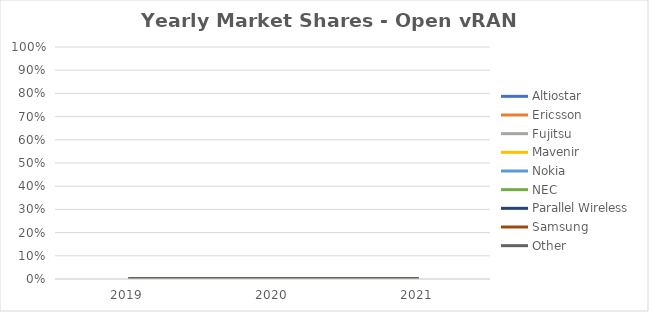
| Category | Altiostar | Ericsson | Fujitsu | Mavenir | Nokia | NEC | Parallel Wireless | Samsung | Other |
|---|---|---|---|---|---|---|---|---|---|
| 2019.0 | 0 | 0 | 0 | 0 | 0 | 0 | 0 | 0 | 0 |
| 2020.0 | 0 | 0 | 0 | 0 | 0 | 0 | 0 | 0 | 0 |
| 2021.0 | 0 | 0 | 0 | 0 | 0 | 0 | 0 | 0 | 0 |